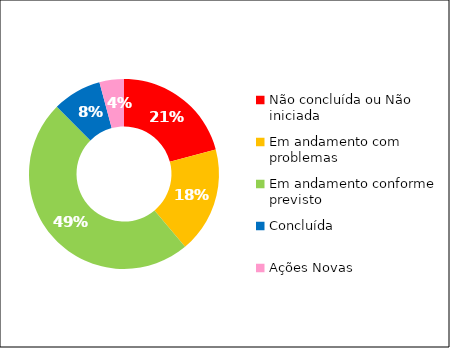
| Category | Series 0 |
|---|---|
| Início planejado posterior | 0 |
| Não concluída ou Não iniciada | 15 |
| Em andamento com problemas | 13 |
| Em andamento conforme previsto | 35 |
| Concluída | 6 |
| Ações Novas | 3 |